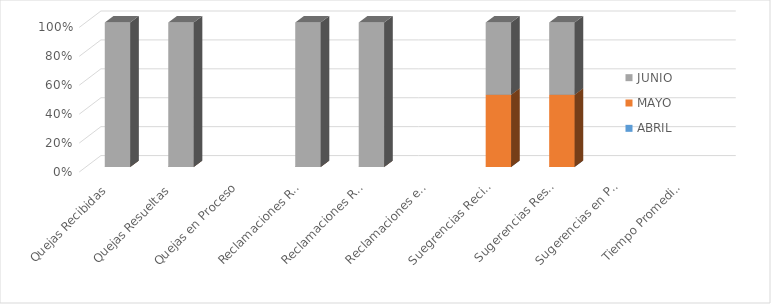
| Category | ABRIL | MAYO | JUNIO |
|---|---|---|---|
| Quejas Recibidas | 0 | 0 | 1 |
| Quejas Resueltas | 0 | 0 | 1 |
| Quejas en Proceso | 0 | 0 | 0 |
| Reclamaciones Recibidas | 0 | 0 | 1 |
| Reclamaciones Resueltas | 0 | 0 | 1 |
| Reclamaciones en Proceso | 0 | 0 | 0 |
| Suegrencias Recibidas | 0 | 1 | 1 |
| Sugerencias Resueltas | 0 | 1 | 1 |
| Sugerencias en Proceso | 0 | 0 | 0 |
| Tiempo Promedio en que fueron Respondidas | 0 | 0 | 0 |